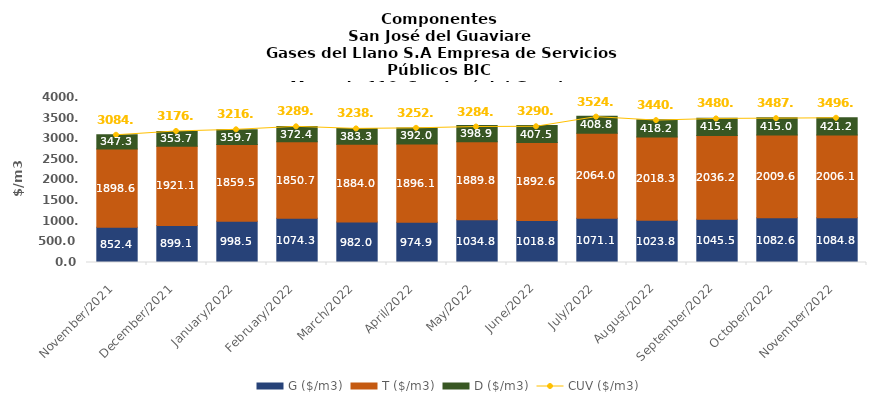
| Category | G ($/m3) | T ($/m3) | D ($/m3) |
|---|---|---|---|
| 2021-11-01 | 852.41 | 1898.55 | 347.28 |
| 2021-12-01 | 899.1 | 1921.09 | 353.72 |
| 2022-01-01 | 998.53 | 1859.54 | 359.67 |
| 2022-02-01 | 1074.31 | 1850.74 | 372.35 |
| 2022-03-01 | 981.99 | 1884.02 | 383.3 |
| 2022-04-01 | 974.88 | 1896.14 | 391.95 |
| 2022-05-01 | 1034.82 | 1889.75 | 398.91 |
| 2022-06-01 | 1018.78 | 1892.55 | 407.54 |
| 2022-07-01 | 1071.1 | 2063.95 | 408.78 |
| 2022-08-01 | 1023.83 | 2018.26 | 418.18 |
| 2022-09-01 | 1045.5 | 2036.21 | 415.42 |
| 2022-10-01 | 1082.55 | 2009.58 | 414.99 |
| 2022-11-01 | 1084.79 | 2006.14 | 421.15 |